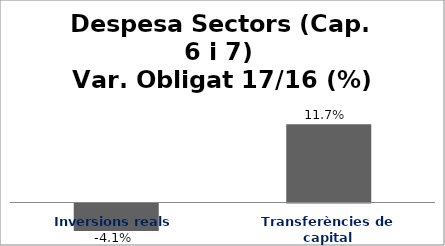
| Category | Series 0 |
|---|---|
| Inversions reals | -0.041 |
| Transferències de capital | 0.117 |